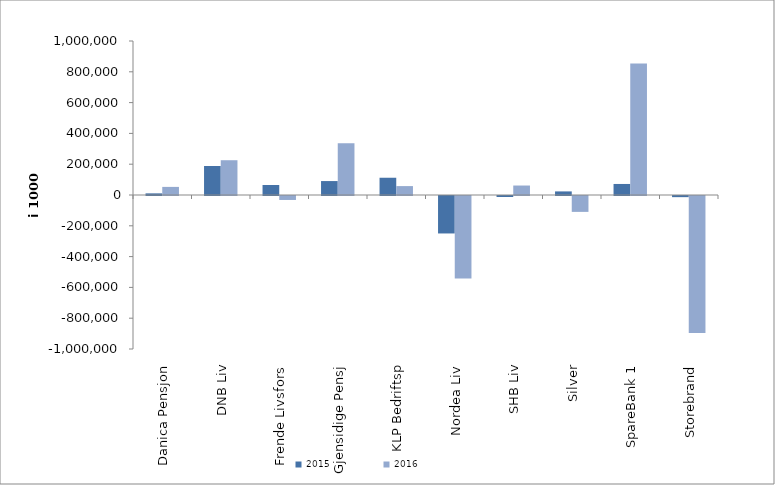
| Category | 2015 | 2016 |
|---|---|---|
| 0 | 10602.298 | 52563.202 |
| 1 | 188499 | 225817 |
| 2 | 64949.969 | -25788.044 |
| 3 | 90505.381 | 335536.562 |
| 4 | 112050 | 57815 |
| 5 | -243247.166 | -536369.096 |
| 6 | -6689 | 61517 |
| 7 | 23327.986 | -103175 |
| 8 | 71636.996 | 853472.123 |
| 9 | -7467.077 | -890405.827 |